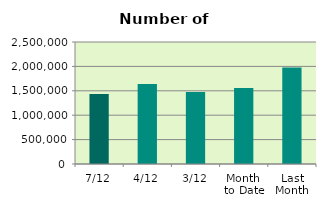
| Category | Series 0 |
|---|---|
| 7/12 | 1436674 |
| 4/12 | 1641392 |
| 3/12 | 1476834 |
| Month 
to Date | 1558100 |
| Last
Month | 1976001.238 |